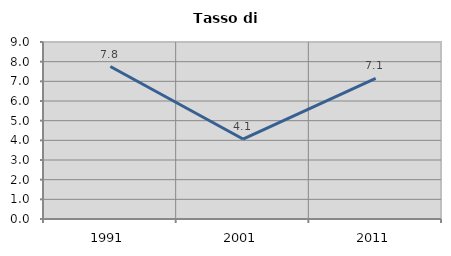
| Category | Tasso di disoccupazione   |
|---|---|
| 1991.0 | 7.752 |
| 2001.0 | 4.066 |
| 2011.0 | 7.147 |